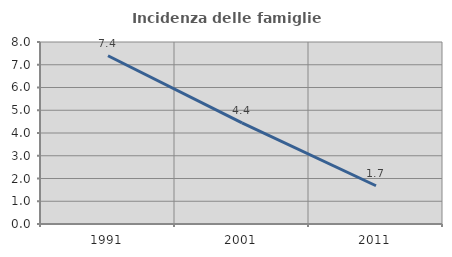
| Category | Incidenza delle famiglie numerose |
|---|---|
| 1991.0 | 7.395 |
| 2001.0 | 4.441 |
| 2011.0 | 1.681 |